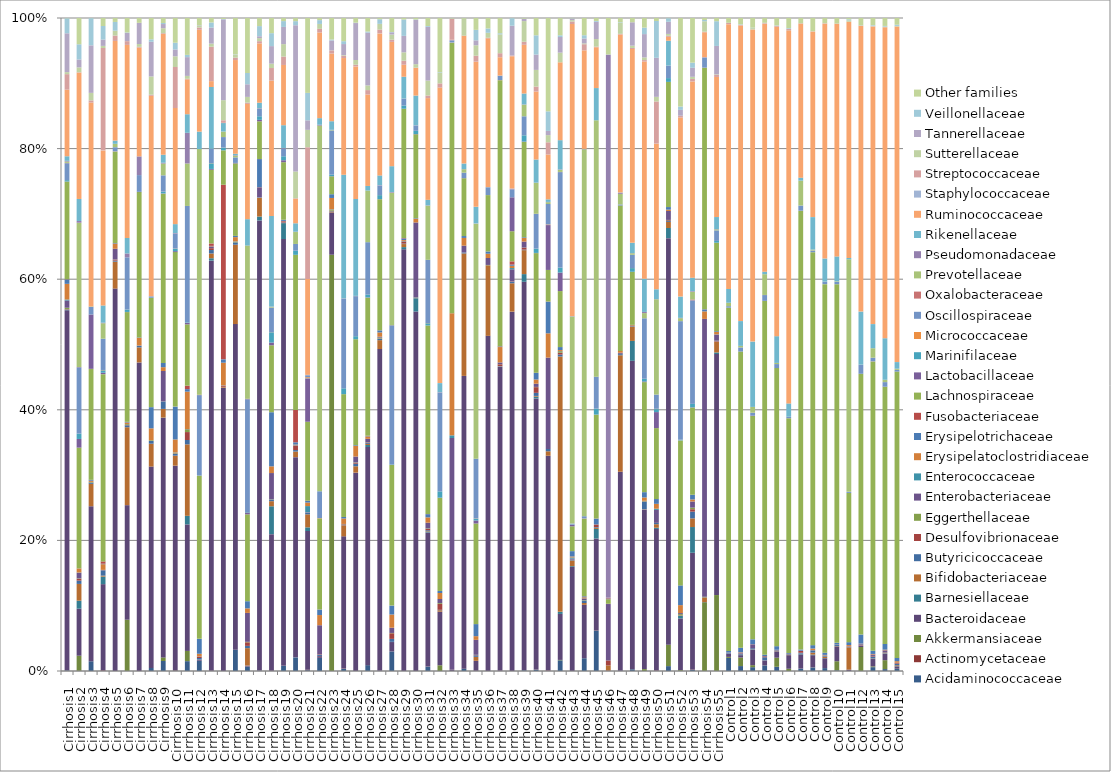
| Category | Acidaminococcaceae | Actinomycetaceae | Akkermansiaceae | Bacteroidaceae | Barnesiellaceae | Bifidobacteriaceae | Butyricicoccaceae | Desulfovibrionaceae | Eggerthellaceae | Enterobacteriaceae | Enterococcaceae | Erysipelatoclostridiaceae | Erysipelotrichaceae | Fusobacteriaceae | Lachnospiraceae | Lactobacillaceae | Marinifilaceae | Micrococcaceae | Oscillospiraceae | Oxalobacteraceae | Prevotellaceae | Pseudomonadaceae | Rikenellaceae | Ruminococcaceae | Staphylococcaceae | Streptococcaceae | Sutterellaceae | Tannerellaceae | Veillonellaceae | Other families |
|---|---|---|---|---|---|---|---|---|---|---|---|---|---|---|---|---|---|---|---|---|---|---|---|---|---|---|---|---|---|---|
| Cirrhosis1 | 0.001 | 0 | 0 | 0.536 | 0.001 | 0 | 0 | 0.001 | 0.002 | 0.011 | 0.001 | 0.023 | 0.007 | 0 | 0.145 | 0 | 0.002 | 0 | 0.025 | 0 | 0.002 | 0.001 | 0.007 | 0.099 | 0 | 0.023 | 0.003 | 0.058 | 0.022 | 0 |
| Cirrhosis2 | 0 | 0 | 0.02 | 0.062 | 0.011 | 0.022 | 0.004 | 0.002 | 0.001 | 0.007 | 0 | 0.005 | 0 | 0 | 0.159 | 0.011 | 0.007 | 0 | 0.088 | 0 | 0.19 | 0.002 | 0.029 | 0.167 | 0 | 0 | 0.006 | 0.01 | 0.02 | 0.035 |
| Cirrhosis3 | 0.015 | 0 | 0 | 0.232 | 0 | 0.033 | 0.002 | 0 | 0.001 | 0 | 0 | 0.002 | 0.001 | 0 | 0.166 | 0.081 | 0 | 0 | 0.011 | 0 | 0.001 | 0 | 0 | 0.305 | 0 | 0.003 | 0.011 | 0.071 | 0.041 | 0 |
| Cirrhosis4 | 0 | 0.001 | 0 | 0.118 | 0.01 | 0.001 | 0.007 | 0 | 0 | 0 | 0 | 0.008 | 0.001 | 0.003 | 0.256 | 0.002 | 0.003 | 0 | 0.043 | 0 | 0.021 | 0.001 | 0.024 | 0.212 | 0 | 0.14 | 0.003 | 0.009 | 0.019 | 0.011 |
| Cirrhosis5 | 0 | 0 | 0 | 0.581 | 0 | 0.041 | 0.002 | 0.002 | 0 | 0.016 | 0 | 0.008 | 0.001 | 0 | 0.139 | 0 | 0 | 0 | 0.006 | 0 | 0.005 | 0 | 0.005 | 0.151 | 0 | 0.008 | 0.007 | 0 | 0.013 | 0.006 |
| Cirrhosis6 | 0 | 0 | 0.076 | 0.171 | 0 | 0.116 | 0.003 | 0 | 0.001 | 0 | 0 | 0.002 | 0.001 | 0 | 0.163 | 0 | 0.004 | 0 | 0.078 | 0 | 0 | 0.006 | 0.023 | 0.287 | 0 | 0.006 | 0 | 0.012 | 0.001 | 0.022 |
| Cirrhosis7 | 0 | 0 | 0 | 0.462 | 0 | 0.023 | 0.002 | 0 | 0 | 0 | 0 | 0.012 | 0.001 | 0 | 0.218 | 0 | 0 | 0 | 0.025 | 0 | 0 | 0.028 | 0 | 0.163 | 0 | 0.001 | 0.004 | 0.032 | 0 | 0.007 |
| Cirrhosis8 | 0.005 | 0 | 0 | 0.304 | 0 | 0.034 | 0.004 | 0 | 0.001 | 0 | 0 | 0.018 | 0.032 | 0 | 0.165 | 0 | 0 | 0 | 0.002 | 0 | 0 | 0 | 0 | 0.302 | 0 | 0.002 | 0.028 | 0.052 | 0.004 | 0.032 |
| Cirrhosis9 | 0.015 | 0 | 0.005 | 0.36 | 0 | 0.013 | 0.011 | 0 | 0 | 0.046 | 0 | 0.006 | 0.006 | 0 | 0.254 | 0 | 0.003 | 0 | 0.024 | 0 | 0.018 | 0.001 | 0.012 | 0.181 | 0 | 0.001 | 0.007 | 0.006 | 0.002 | 0.008 |
| Cirrhosis10 | 0.001 | 0.001 | 0 | 0.301 | 0 | 0.015 | 0.003 | 0.001 | 0.001 | 0 | 0 | 0.019 | 0.048 | 0 | 0.228 | 0.001 | 0.004 | 0 | 0.022 | 0 | 0 | 0.001 | 0.013 | 0.171 | 0 | 0.06 | 0.016 | 0.01 | 0.01 | 0.036 |
| Cirrhosis11 | 0.013 | 0 | 0.014 | 0.172 | 0.012 | 0.097 | 0.006 | 0.011 | 0.004 | 0 | 0 | 0.051 | 0.003 | 0.005 | 0.083 | 0.002 | 0.001 | 0 | 0.158 | 0 | 0.058 | 0.042 | 0.025 | 0.047 | 0 | 0.001 | 0.004 | 0.025 | 0.003 | 0.05 |
| Cirrhosis12 | 0.015 | 0 | 0 | 0.002 | 0 | 0 | 0.002 | 0.001 | 0 | 0.001 | 0 | 0.004 | 0.022 | 0 | 0.24 | 0 | 0.001 | 0 | 0.118 | 0.001 | 0.361 | 0 | 0.026 | 0.15 | 0 | 0.003 | 0.002 | 0.001 | 0 | 0.011 |
| Cirrhosis13 | 0 | 0 | 0 | 0.617 | 0.004 | 0.007 | 0.005 | 0.003 | 0 | 0.003 | 0 | 0.001 | 0 | 0.004 | 0.111 | 0.001 | 0.008 | 0 | 0.021 | 0 | 0 | 0 | 0.093 | 0.009 | 0 | 0.052 | 0.005 | 0.024 | 0.008 | 0.007 |
| Cirrhosis14 | 0 | 0 | 0 | 0.427 | 0 | 0.001 | 0 | 0.001 | 0 | 0.001 | 0 | 0.034 | 0.005 | 0.263 | 0.052 | 0 | 0.004 | 0 | 0.016 | 0 | 0.008 | 0 | 0.013 | 0 | 0 | 0.004 | 0.03 | 0.122 | 0.001 | 0.002 |
| Cirrhosis15 | 0.032 | 0 | 0 | 0.485 | 0 | 0.118 | 0.003 | 0 | 0.001 | 0 | 0 | 0.006 | 0.002 | 0 | 0.108 | 0.001 | 0 | 0 | 0.008 | 0 | 0.003 | 0.001 | 0.002 | 0.139 | 0 | 0.004 | 0.005 | 0 | 0 | 0.054 |
| Cirrhosis16 | 0.005 | 0 | 0 | 0.001 | 0 | 0.021 | 0.003 | 0.004 | 0.001 | 0.034 | 0 | 0.005 | 0.009 | 0 | 0.103 | 0.002 | 0.001 | 0 | 0.134 | 0.001 | 0.182 | 0 | 0.031 | 0.137 | 0 | 0.001 | 0.007 | 0.015 | 0.013 | 0.065 |
| Cirrhosis17 | 0.001 | 0 | 0 | 0.655 | 0.006 | 0.027 | 0 | 0 | 0 | 0.015 | 0 | 0 | 0.041 | 0 | 0.055 | 0.002 | 0.005 | 0 | 0.011 | 0 | 0 | 0 | 0.008 | 0.086 | 0 | 0.003 | 0.004 | 0.003 | 0.015 | 0.012 |
| Cirrhosis18 | 0 | 0 | 0 | 0.169 | 0.035 | 0.006 | 0.002 | 0 | 0 | 0.033 | 0 | 0.008 | 0.067 | 0 | 0.083 | 0.003 | 0.013 | 0 | 0.03 | 0 | 0.001 | 0 | 0.112 | 0.168 | 0 | 0.015 | 0.005 | 0.022 | 0.016 | 0.019 |
| Cirrhosis19 | 0.008 | 0 | 0 | 0.644 | 0.024 | 0 | 0.001 | 0.002 | 0 | 0 | 0 | 0 | 0.002 | 0 | 0.087 | 0.003 | 0.006 | 0 | 0.012 | 0 | 0 | 0 | 0.034 | 0.091 | 0 | 0.013 | 0.019 | 0.026 | 0.009 | 0.005 |
| Cirrhosis20 | 0.019 | 0 | 0 | 0.278 | 0 | 0.008 | 0.002 | 0.006 | 0 | 0 | 0 | 0.001 | 0.003 | 0.045 | 0.215 | 0 | 0.006 | 0 | 0.009 | 0 | 0.017 | 0.001 | 0.012 | 0.034 | 0 | 0.001 | 0.037 | 0.203 | 0.006 | 0.004 |
| Cirrhosis21 | 0.001 | 0.001 | 0 | 0.209 | 0.006 | 0.02 | 0.002 | 0 | 0 | 0.001 | 0.009 | 0.005 | 0.003 | 0 | 0.119 | 0.065 | 0 | 0.002 | 0.003 | 0 | 0 | 0.001 | 0 | 0.144 | 0 | 0.198 | 0.026 | 0.014 | 0.041 | 0.113 |
| Cirrhosis22 | 0.019 | 0 | 0 | 0.003 | 0 | 0 | 0.001 | 0.001 | 0 | 0.042 | 0 | 0.015 | 0.008 | 0 | 0.132 | 0 | 0 | 0 | 0.039 | 0 | 0.529 | 0.001 | 0.01 | 0.124 | 0 | 0.005 | 0.007 | 0 | 0.006 | 0.003 |
| Cirrhosis23 | 0 | 0 | 0.599 | 0.061 | 0 | 0.001 | 0.001 | 0 | 0.002 | 0 | 0 | 0.016 | 0.005 | 0 | 0.026 | 0 | 0.002 | 0 | 0.064 | 0 | 0.001 | 0 | 0.012 | 0.097 | 0 | 0.005 | 0 | 0.014 | 0.001 | 0.031 |
| Cirrhosis24 | 0.003 | 0 | 0 | 0.181 | 0 | 0.015 | 0 | 0.001 | 0 | 0 | 0 | 0.007 | 0.002 | 0 | 0.168 | 0 | 0.008 | 0 | 0.123 | 0 | 0 | 0 | 0.17 | 0.16 | 0 | 0.003 | 0.001 | 0.015 | 0.004 | 0.032 |
| Cirrhosis25 | 0 | 0 | 0 | 0.293 | 0 | 0.009 | 0.004 | 0.001 | 0.001 | 0.009 | 0 | 0.016 | 0.001 | 0 | 0.157 | 0 | 0.004 | 0 | 0.059 | 0 | 0 | 0 | 0.143 | 0.196 | 0 | 0.003 | 0.007 | 0.055 | 0.001 | 0.007 |
| Cirrhosis26 | 0.008 | 0 | 0 | 0.285 | 0.003 | 0.001 | 0.001 | 0.001 | 0 | 0.005 | 0 | 0.003 | 0 | 0 | 0.18 | 0 | 0.004 | 0 | 0.069 | 0 | 0.067 | 0 | 0.006 | 0.119 | 0 | 0.006 | 0.006 | 0.069 | 0.001 | 0.018 |
| Cirrhosis27 | 0 | 0 | 0 | 0.484 | 0 | 0.013 | 0.002 | 0 | 0.001 | 0.001 | 0 | 0.006 | 0.003 | 0 | 0.197 | 0 | 0.006 | 0 | 0.014 | 0 | 0 | 0.001 | 0.015 | 0.214 | 0 | 0.006 | 0.009 | 0 | 0.007 | 0.002 |
| Cirrhosis28 | 0.027 | 0 | 0 | 0.013 | 0 | 0 | 0.004 | 0.008 | 0 | 0.007 | 0 | 0.018 | 0.013 | 0 | 0.197 | 0 | 0.001 | 0 | 0.195 | 0 | 0.186 | 0.001 | 0.036 | 0.174 | 0 | 0.003 | 0.007 | 0.003 | 0 | 0.02 |
| Cirrhosis29 | 0 | 0 | 0 | 0.635 | 0.003 | 0.005 | 0.001 | 0.003 | 0 | 0.001 | 0 | 0.001 | 0.002 | 0.001 | 0.195 | 0 | 0.005 | 0 | 0.01 | 0 | 0 | 0 | 0.033 | 0.018 | 0 | 0.006 | 0.013 | 0.025 | 0.025 | 0.002 |
| Cirrhosis30 | 0 | 0 | 0 | 0.546 | 0.02 | 0 | 0.001 | 0 | 0 | 0.113 | 0 | 0.006 | 0.001 | 0 | 0.127 | 0 | 0.005 | 0 | 0.008 | 0 | 0 | 0 | 0.045 | 0.042 | 0 | 0 | 0.005 | 0.067 | 0.001 | 0.002 |
| Cirrhosis31 | 0.006 | 0 | 0 | 0.177 | 0.001 | 0.001 | 0.001 | 0.002 | 0.001 | 0.008 | 0 | 0.007 | 0.004 | 0 | 0.249 | 0 | 0.003 | 0 | 0.083 | 0 | 0.072 | 0 | 0.007 | 0.134 | 0 | 0.003 | 0.02 | 0.071 | 0.001 | 0.011 |
| Cirrhosis32 | 0 | 0 | 0.006 | 0.059 | 0 | 0.002 | 0 | 0.006 | 0.001 | 0.005 | 0 | 0.007 | 0.002 | 0 | 0.102 | 0 | 0.007 | 0 | 0.109 | 0 | 0 | 0 | 0.01 | 0.325 | 0 | 0.005 | 0.012 | 0 | 0 | 0.059 |
| Cirrhosis33 | 0 | 0 | 0 | 0.002 | 0 | 0 | 0 | 0 | 0 | 0.352 | 0.004 | 0.185 | 0 | 0 | 0.411 | 0 | 0 | 0 | 0.003 | 0 | 0 | 0.001 | 0 | 0 | 0 | 0.032 | 0 | 0 | 0 | 0.001 |
| Cirrhosis34 | 0.003 | 0 | 0 | 0.445 | 0 | 0.186 | 0.001 | 0 | 0 | 0.01 | 0 | 0.012 | 0.003 | 0 | 0.088 | 0 | 0 | 0 | 0.008 | 0 | 0.005 | 0 | 0.008 | 0.194 | 0 | 0 | 0.027 | 0 | 0 | 0 |
| Cirrhosis35 | 0 | 0 | 0 | 0.014 | 0 | 0.006 | 0.002 | 0.001 | 0 | 0.021 | 0 | 0.005 | 0.017 | 0 | 0.144 | 0.004 | 0.003 | 0 | 0.086 | 0 | 0.337 | 0 | 0.024 | 0.208 | 0 | 0.009 | 0.015 | 0.007 | 0.015 | 0.017 |
| Cirrhosis36 | 0 | 0 | 0 | 0.505 | 0 | 0.106 | 0 | 0 | 0 | 0.01 | 0 | 0.007 | 0.003 | 0 | 0.085 | 0 | 0 | 0 | 0.012 | 0 | 0 | 0 | 0 | 0.224 | 0 | 0.001 | 0.007 | 0 | 0.007 | 0.016 |
| Cirrhosis37 | 0 | 0 | 0 | 0.445 | 0 | 0 | 0.001 | 0.003 | 0 | 0.003 | 0 | 0.023 | 0.001 | 0 | 0.39 | 0 | 0 | 0 | 0.006 | 0 | 0 | 0 | 0 | 0.027 | 0 | 0.006 | 0.028 | 0 | 0.002 | 0.022 |
| Cirrhosis38 | 0 | 0 | 0 | 0.547 | 0 | 0.043 | 0.002 | 0.001 | 0 | 0.019 | 0.002 | 0.003 | 0.002 | 0.005 | 0.046 | 0.052 | 0 | 0 | 0.012 | 0 | 0 | 0.001 | 0 | 0.201 | 0 | 0.001 | 0 | 0.045 | 0.012 | 0 |
| Cirrhosis39 | 0.001 | 0 | 0 | 0.589 | 0.012 | 0.036 | 0.001 | 0.003 | 0 | 0.009 | 0 | 0.006 | 0.001 | 0 | 0.145 | 0.001 | 0.009 | 0 | 0.029 | 0 | 0.018 | 0 | 0.017 | 0.074 | 0 | 0.005 | 0.031 | 0.003 | 0 | 0.001 |
| Cirrhosis40 | 0.002 | 0 | 0 | 0.395 | 0.003 | 0.001 | 0.005 | 0.008 | 0 | 0.005 | 0 | 0.006 | 0.01 | 0 | 0.175 | 0 | 0.006 | 0 | 0.051 | 0 | 0.045 | 0 | 0.034 | 0.099 | 0 | 0.007 | 0.024 | 0.022 | 0.028 | 0.025 |
| Cirrhosis41 | 0 | 0.001 | 0 | 0.325 | 0 | 0.007 | 0.003 | 0 | 0 | 0.138 | 0 | 0.037 | 0.048 | 0 | 0.048 | 0.068 | 0 | 0.001 | 0.031 | 0 | 0.003 | 0 | 0.004 | 0.068 | 0 | 0.018 | 0.011 | 0.006 | 0.03 | 0.141 |
| Cirrhosis42 | 0.014 | 0 | 0.001 | 0.061 | 0.003 | 0.338 | 0.003 | 0.002 | 0.002 | 0 | 0 | 0.001 | 0.004 | 0 | 0.074 | 0.024 | 0.007 | 0 | 0.127 | 0 | 0.003 | 0.001 | 0.039 | 0.103 | 0 | 0 | 0.013 | 0.021 | 0.002 | 0.023 |
| Cirrhosis43 | 0 | 0 | 0 | 0.154 | 0.001 | 0.008 | 0.001 | 0 | 0 | 0.002 | 0.002 | 0.002 | 0.008 | 0 | 0.037 | 0.002 | 0 | 0 | 0.001 | 0 | 0.306 | 0 | 0 | 0.432 | 0 | 0.004 | 0.002 | 0.002 | 0 | 0 |
| Cirrhosis44 | 0.019 | 0 | 0 | 0.081 | 0 | 0.003 | 0.004 | 0 | 0.001 | 0.003 | 0 | 0.002 | 0.001 | 0 | 0.118 | 0 | 0 | 0 | 0.003 | 0 | 0.558 | 0 | 0 | 0.15 | 0 | 0.009 | 0.001 | 0.007 | 0.005 | 0.026 |
| Cirrhosis45 | 0.052 | 0 | 0 | 0.12 | 0.012 | 0.002 | 0.001 | 0.003 | 0 | 0.001 | 0 | 0 | 0.007 | 0 | 0.135 | 0 | 0.008 | 0 | 0.042 | 0 | 0.335 | 0 | 0.042 | 0.053 | 0 | 0.001 | 0.01 | 0.022 | 0.001 | 0.004 |
| Cirrhosis46 | 0 | 0 | 0 | 0 | 0 | 0.005 | 0 | 0.004 | 0 | 0.049 | 0 | 0 | 0 | 0 | 0.004 | 0.001 | 0 | 0 | 0 | 0 | 0 | 0.472 | 0 | 0 | 0 | 0 | 0 | 0 | 0 | 0.032 |
| Cirrhosis47 | 0.001 | 0 | 0 | 0.303 | 0 | 0.177 | 0.002 | 0 | 0 | 0.002 | 0 | 0.003 | 0 | 0 | 0.221 | 0 | 0 | 0 | 0.002 | 0 | 0.016 | 0.002 | 0 | 0.241 | 0 | 0.001 | 0.017 | 0 | 0.001 | 0.007 |
| Cirrhosis48 | 0.003 | 0 | 0 | 0.457 | 0.029 | 0.021 | 0.001 | 0 | 0 | 0 | 0 | 0.001 | 0 | 0 | 0.079 | 0 | 0.005 | 0 | 0.02 | 0 | 0.002 | 0 | 0.015 | 0.287 | 0 | 0.002 | 0.003 | 0.035 | 0 | 0.006 |
| Cirrhosis49 | 0 | 0 | 0.002 | 0.193 | 0 | 0 | 0.009 | 0 | 0.001 | 0 | 0 | 0.004 | 0.006 | 0 | 0.133 | 0.001 | 0.003 | 0 | 0.073 | 0 | 0.006 | 0.001 | 0.04 | 0.264 | 0 | 0.002 | 0.003 | 0.028 | 0.008 | 0.012 |
| Cirrhosis50 | 0 | 0 | 0 | 0.201 | 0.002 | 0.005 | 0.002 | 0 | 0 | 0.018 | 0.002 | 0.007 | 0.007 | 0 | 0.101 | 0.023 | 0.004 | 0 | 0.02 | 0 | 0.136 | 0 | 0.014 | 0.207 | 0 | 0.06 | 0.007 | 0.056 | 0.052 | 0.004 |
| Cirrhosis51 | 0.007 | 0 | 0.032 | 0.607 | 0.015 | 0.009 | 0.001 | 0.001 | 0 | 0.013 | 0 | 0.002 | 0.004 | 0 | 0.187 | 0 | 0.006 | 0 | 0.018 | 0 | 0 | 0 | 0.037 | 0.006 | 0 | 0.002 | 0.003 | 0.018 | 0.005 | 0 |
| Cirrhosis52 | 0 | 0 | 0.001 | 0.07 | 0.003 | 0 | 0 | 0.001 | 0.002 | 0.001 | 0 | 0.011 | 0.027 | 0 | 0.197 | 0 | 0.001 | 0 | 0.161 | 0 | 0.004 | 0 | 0.029 | 0.243 | 0 | 0.002 | 0 | 0.008 | 0.005 | 0.12 |
| Cirrhosis53 | 0.001 | 0 | 0 | 0.151 | 0.033 | 0.011 | 0.009 | 0.003 | 0.002 | 0.008 | 0 | 0.003 | 0.006 | 0 | 0.113 | 0 | 0.004 | 0 | 0.134 | 0.001 | 0.01 | 0.001 | 0.017 | 0.253 | 0 | 0.003 | 0.003 | 0.012 | 0.007 | 0.058 |
| Cirrhosis54 | 0 | 0 | 0.1 | 0 | 0 | 0.007 | 0 | 0 | 0.001 | 0.405 | 0 | 0.011 | 0.003 | 0 | 0.353 | 0 | 0 | 0 | 0.015 | 0 | 0 | 0 | 0 | 0.036 | 0 | 0.001 | 0.015 | 0 | 0.002 | 0.003 |
| Cirrhosis55 | 0 | 0 | 0.112 | 0.356 | 0.002 | 0.016 | 0 | 0.001 | 0.001 | 0.009 | 0 | 0.004 | 0.001 | 0 | 0.13 | 0 | 0.003 | 0 | 0.016 | 0 | 0.001 | 0 | 0.018 | 0.207 | 0 | 0.003 | 0.001 | 0.042 | 0.037 | 0.005 |
| Control1 | 0.02 | 0 | 0.002 | 0.005 | 0 | 0 | 0.001 | 0 | 0 | 0 | 0 | 0 | 0.002 | 0 | 0.513 | 0 | 0 | 0 | 0.002 | 0 | 0.005 | 0 | 0.021 | 0.396 | 0 | 0.002 | 0 | 0 | 0 | 0.007 |
| Control2 | 0.008 | 0 | 0.013 | 0.004 | 0 | 0.001 | 0.001 | 0.001 | 0 | 0.001 | 0 | 0.001 | 0.007 | 0 | 0.454 | 0 | 0 | 0 | 0.006 | 0 | 0.002 | 0 | 0.038 | 0.453 | 0 | 0.001 | 0 | 0 | 0.001 | 0.01 |
| Control3 | 0.006 | 0 | 0.003 | 0.023 | 0 | 0 | 0.002 | 0 | 0 | 0.006 | 0 | 0 | 0.007 | 0 | 0.334 | 0.001 | 0 | 0 | 0.004 | 0 | 0.009 | 0 | 0.098 | 0.467 | 0 | 0 | 0.002 | 0 | 0.001 | 0.015 |
| Control4 | 0.009 | 0 | 0 | 0.008 | 0 | 0 | 0.005 | 0.002 | 0 | 0 | 0 | 0 | 0.002 | 0 | 0.57 | 0 | 0 | 0 | 0.009 | 0 | 0.033 | 0 | 0.004 | 0.399 | 0 | 0.001 | 0 | 0 | 0 | 0.008 |
| Control5 | 0.007 | 0 | 0.014 | 0.01 | 0 | 0 | 0.001 | 0 | 0 | 0.001 | 0 | 0 | 0.006 | 0 | 0.434 | 0 | 0 | 0 | 0.006 | 0 | 0.002 | 0 | 0.042 | 0.483 | 0 | 0.001 | 0 | 0 | 0.001 | 0.012 |
| Control6 | 0 | 0 | 0.004 | 0.022 | 0 | 0.001 | 0.002 | 0 | 0 | 0 | 0 | 0 | 0 | 0 | 0.381 | 0 | 0 | 0 | 0.002 | 0 | 0 | 0 | 0.022 | 0.605 | 0 | 0.002 | 0 | 0 | 0.001 | 0.016 |
| Control7 | 0.004 | 0 | 0 | 0.021 | 0.001 | 0 | 0.001 | 0.003 | 0 | 0 | 0 | 0 | 0.002 | 0 | 0.658 | 0 | 0 | 0 | 0.008 | 0 | 0.037 | 0 | 0.004 | 0.231 | 0 | 0 | 0 | 0 | 0 | 0.008 |
| Control8 | 0.006 | 0 | 0 | 0.02 | 0.001 | 0.003 | 0.004 | 0 | 0 | 0 | 0 | 0.003 | 0.005 | 0 | 0.631 | 0 | 0 | 0 | 0.002 | 0 | 0.002 | 0 | 0.052 | 0.298 | 0 | 0 | 0 | 0 | 0 | 0.021 |
| Control9 | 0.004 | 0 | 0 | 0.015 | 0 | 0.002 | 0.002 | 0 | 0 | 0 | 0 | 0.001 | 0.003 | 0 | 0.564 | 0 | 0 | 0 | 0.004 | 0 | 0 | 0 | 0.035 | 0.359 | 0 | 0.001 | 0 | 0 | 0 | 0.008 |
| Control10 | 0.001 | 0 | 0.014 | 0.023 | 0 | 0 | 0.002 | 0.001 | 0 | 0 | 0 | 0 | 0.003 | 0 | 0.562 | 0 | 0 | 0 | 0.004 | 0 | 0.001 | 0 | 0.039 | 0.365 | 0 | 0 | 0.001 | 0 | 0 | 0.008 |
| Control11 | 0 | 0 | 0 | 0.002 | 0 | 0.035 | 0.001 | 0 | 0 | 0.001 | 0 | 0.002 | 0.005 | 0 | 0.235 | 0 | 0 | 0 | 0.002 | 0 | 0.366 | 0 | 0.002 | 0.372 | 0 | 0 | 0.002 | 0 | 0.002 | 0.002 |
| Control12 | 0 | 0 | 0.038 | 0.002 | 0 | 0 | 0 | 0.001 | 0 | 0.001 | 0 | 0 | 0.014 | 0 | 0.408 | 0 | 0 | 0 | 0.014 | 0 | 0 | 0 | 0.083 | 0.447 | 0 | 0 | 0 | 0 | 0 | 0.012 |
| Control13 | 0.006 | 0 | 0.001 | 0.011 | 0 | 0.001 | 0.003 | 0.001 | 0 | 0.002 | 0 | 0.001 | 0.005 | 0 | 0.448 | 0 | 0 | 0 | 0.005 | 0 | 0.015 | 0 | 0.037 | 0.461 | 0 | 0 | 0.001 | 0 | 0.001 | 0.011 |
| Control14 | 0.003 | 0 | 0.014 | 0.01 | 0 | 0.001 | 0.001 | 0.001 | 0 | 0.003 | 0 | 0.001 | 0.009 | 0 | 0.394 | 0 | 0 | 0 | 0.007 | 0 | 0.004 | 0 | 0.064 | 0.477 | 0 | 0 | 0.001 | 0 | 0.001 | 0.012 |
| Control15 | 0.003 | 0 | 0 | 0.004 | 0 | 0.001 | 0.002 | 0.001 | 0 | 0.001 | 0 | 0.002 | 0.005 | 0 | 0.44 | 0 | 0 | 0 | 0.003 | 0 | 0.002 | 0 | 0.01 | 0.515 | 0 | 0 | 0.001 | 0 | 0.002 | 0.01 |